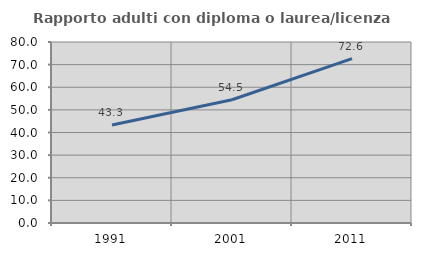
| Category | Rapporto adulti con diploma o laurea/licenza media  |
|---|---|
| 1991.0 | 43.316 |
| 2001.0 | 54.478 |
| 2011.0 | 72.632 |